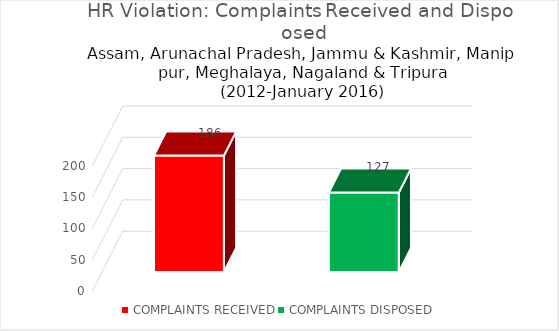
| Category | Series 0 |
|---|---|
| COMPLAINTS RECEIVED | 186 |
| COMPLAINTS DISPOSED | 127 |